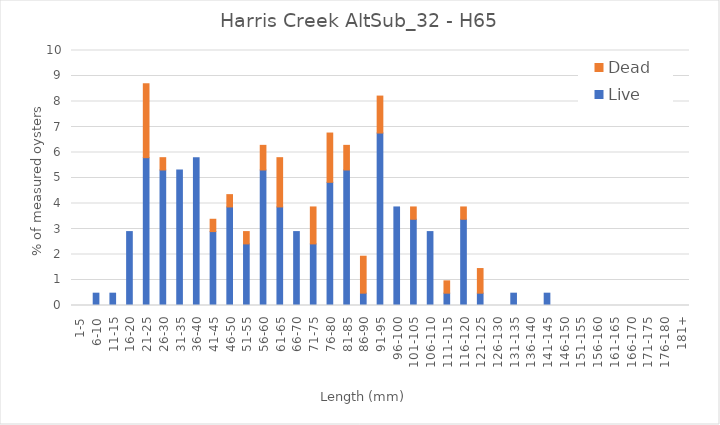
| Category | Live | Dead |
|---|---|---|
| 1-5 | 0 | 0 |
| 6-10 | 0.483 | 0 |
| 11-15 | 0.483 | 0 |
| 16-20 | 2.899 | 0 |
| 21-25 | 5.797 | 2.899 |
| 26-30 | 5.314 | 0.483 |
| 31-35 | 5.314 | 0 |
| 36-40 | 5.797 | 0 |
| 41-45 | 2.899 | 0.483 |
| 46-50 | 3.865 | 0.483 |
| 51-55 | 2.415 | 0.483 |
| 56-60 | 5.314 | 0.966 |
| 61-65 | 3.865 | 1.932 |
| 66-70 | 2.899 | 0 |
| 71-75 | 2.415 | 1.449 |
| 76-80 | 4.831 | 1.932 |
| 81-85 | 5.314 | 0.966 |
| 86-90 | 0.483 | 1.449 |
| 91-95 | 6.763 | 1.449 |
| 96-100 | 3.865 | 0 |
| 101-105 | 3.382 | 0.483 |
| 106-110 | 2.899 | 0 |
| 111-115 | 0.483 | 0.483 |
| 116-120 | 3.382 | 0.483 |
| 121-125 | 0.483 | 0.966 |
| 126-130 | 0 | 0 |
| 131-135 | 0.483 | 0 |
| 136-140 | 0 | 0 |
| 141-145 | 0.483 | 0 |
| 146-150 | 0 | 0 |
| 151-155 | 0 | 0 |
| 156-160 | 0 | 0 |
| 161-165 | 0 | 0 |
| 166-170 | 0 | 0 |
| 171-175 | 0 | 0 |
| 176-180 | 0 | 0 |
| 181+ | 0 | 0 |